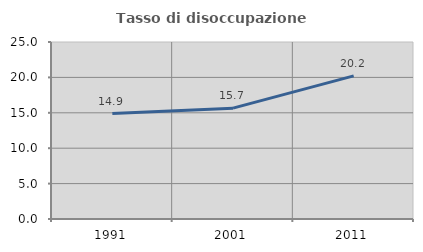
| Category | Tasso di disoccupazione giovanile  |
|---|---|
| 1991.0 | 14.887 |
| 2001.0 | 15.657 |
| 2011.0 | 20.217 |